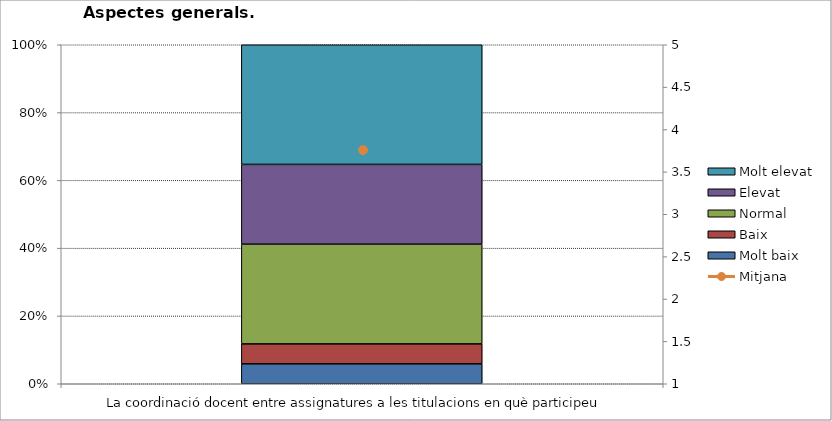
| Category | Molt baix | Baix | Normal  | Elevat | Molt elevat |
|---|---|---|---|---|---|
| La coordinació docent entre assignatures a les titulacions en què participeu | 1 | 1 | 5 | 4 | 6 |